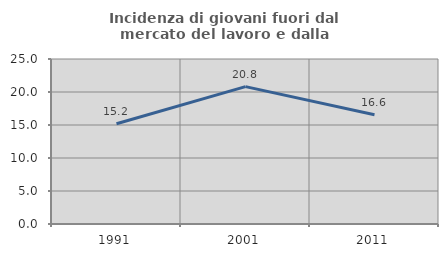
| Category | Incidenza di giovani fuori dal mercato del lavoro e dalla formazione  |
|---|---|
| 1991.0 | 15.183 |
| 2001.0 | 20.811 |
| 2011.0 | 16.561 |